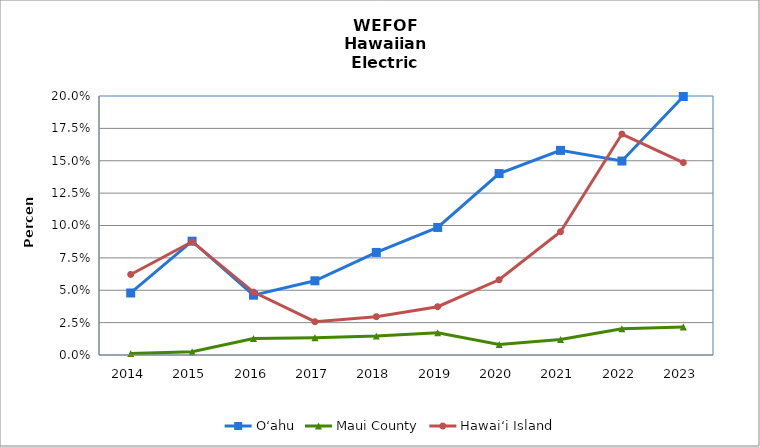
| Category | O‘ahu | Maui County | Hawai‘i Island |
|---|---|---|---|
| 2014.0 | 0.048 | 0.001 | 0.062 |
| 2015.0 | 0.088 | 0.002 | 0.088 |
| 2016.0 | 0.046 | 0.013 | 0.049 |
| 2017.0 | 0.057 | 0.013 | 0.026 |
| 2018.0 | 0.079 | 0.015 | 0.03 |
| 2019.0 | 0.098 | 0.017 | 0.037 |
| 2020.0 | 0.14 | 0.008 | 0.058 |
| 2021.0 | 0.158 | 0.012 | 0.095 |
| 2022.0 | 0.15 | 0.02 | 0.171 |
| 2023.0 | 0.2 | 0.022 | 0.149 |